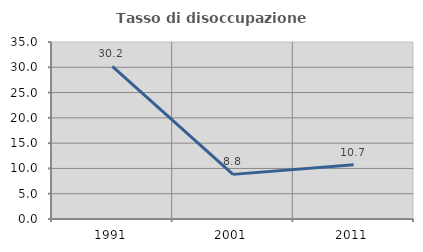
| Category | Tasso di disoccupazione giovanile  |
|---|---|
| 1991.0 | 30.189 |
| 2001.0 | 8.824 |
| 2011.0 | 10.714 |